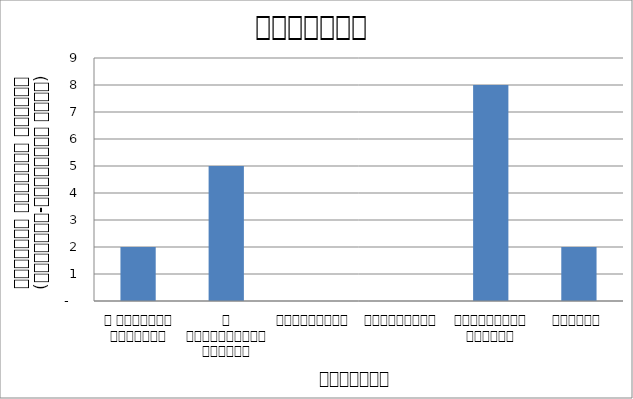
| Category | सुरक्षा |
|---|---|
| द हिमालयन टाइम्स् | 2 |
| द काठमाण्डौं पोस्ट् | 5 |
| रिपब्लिका | 0 |
| कान्तिपुर | 0 |
| अन्नपूर्ण पोस्ट् | 8 |
| नागरिक | 2 |